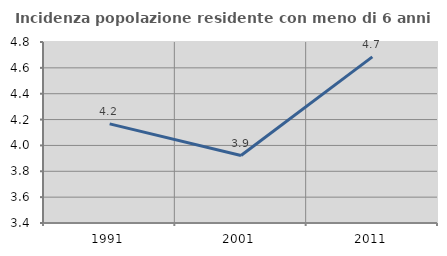
| Category | Incidenza popolazione residente con meno di 6 anni |
|---|---|
| 1991.0 | 4.167 |
| 2001.0 | 3.922 |
| 2011.0 | 4.685 |